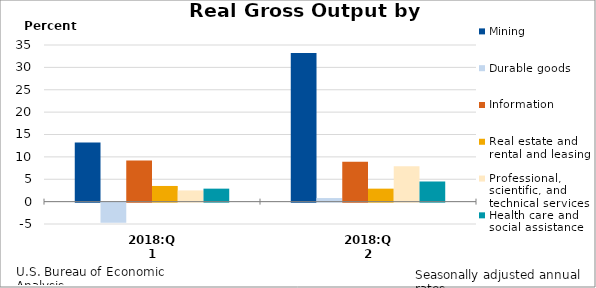
| Category | Mining | Durable goods | Information | Real estate and rental and leasing | Professional, scientific, and technical services | Health care and social assistance |
|---|---|---|---|---|---|---|
| 2018:Q1 | 13.2 | -4.5 | 9.2 | 3.5 | 2.5 | 2.9 |
| 2018:Q2 | 33.2 | 0.8 | 8.9 | 2.9 | 7.9 | 4.5 |